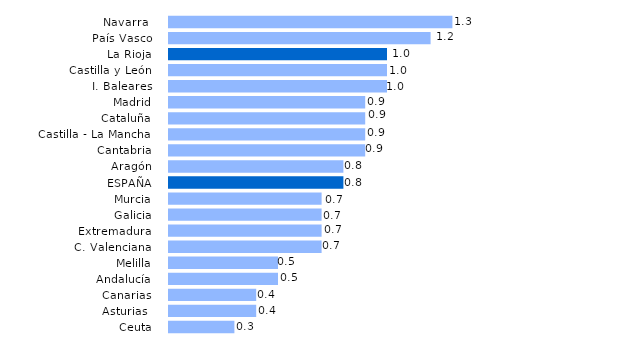
| Category | Series 0 |
|---|---|
| Ceuta | 0.3 |
| Asturias  | 0.4 |
| Canarias | 0.4 |
| Andalucía | 0.5 |
| Melilla | 0.5 |
| C. Valenciana | 0.7 |
| Extremadura | 0.7 |
| Galicia | 0.7 |
| Murcia | 0.7 |
| ESPAÑA | 0.8 |
| Aragón | 0.8 |
| Cantabria | 0.9 |
| Castilla - La Mancha | 0.9 |
| Cataluña | 0.9 |
| Madrid | 0.9 |
| I. Baleares | 1 |
| Castilla y León | 1 |
| La Rioja | 1 |
| País Vasco | 1.2 |
| Navarra  | 1.3 |